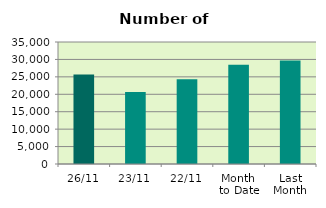
| Category | Series 0 |
|---|---|
| 26/11 | 25644 |
| 23/11 | 20660 |
| 22/11 | 24334 |
| Month 
to Date | 28503.556 |
| Last
Month | 29672.087 |